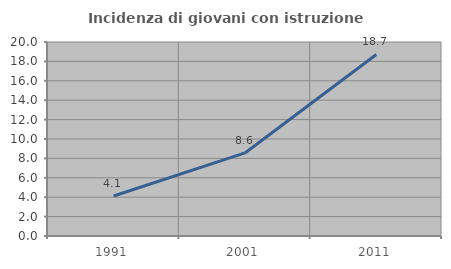
| Category | Incidenza di giovani con istruzione universitaria |
|---|---|
| 1991.0 | 4.12 |
| 2001.0 | 8.564 |
| 2011.0 | 18.717 |